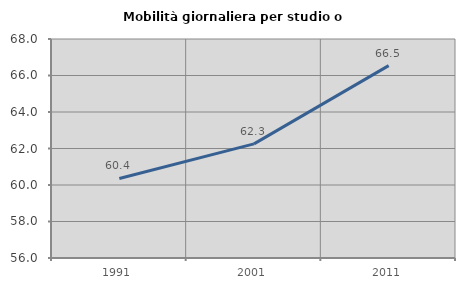
| Category | Mobilità giornaliera per studio o lavoro |
|---|---|
| 1991.0 | 60.358 |
| 2001.0 | 62.256 |
| 2011.0 | 66.541 |